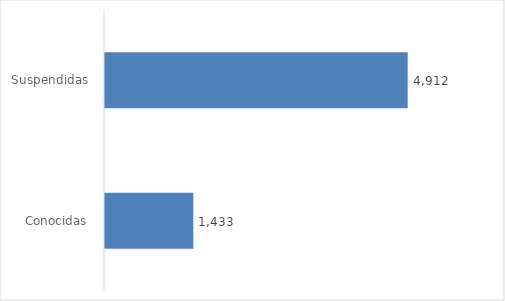
| Category | Series 0 |
|---|---|
| Conocidas  | 0.226 |
| Suspendidas  | 0.774 |